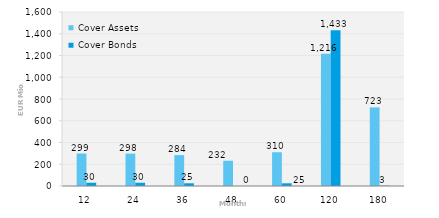
| Category | Cover Assets | Cover Bonds |
|---|---|---|
| 12.0 | 298.632 | 30 |
| 24.0 | 297.799 | 30 |
| 36.0 | 284.067 | 25 |
| 48.0 | 232.127 | 0 |
| 60.0 | 310.296 | 25 |
| 120.0 | 1215.591 | 1433.083 |
| 180.0 | 722.734 | 3 |